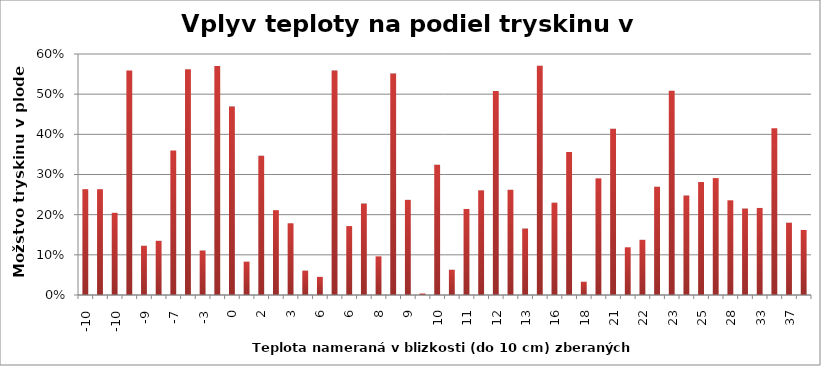
| Category | Series 0 |
|---|---|
| -9.6 | 0.263 |
| -9.6 | 0.263 |
| -9.52 | 0.205 |
| -8.81 | 0.559 |
| -8.74 | 0.123 |
| -8.46 | 0.135 |
| -6.75 | 0.36 |
| -5.08 | 0.562 |
| -2.69 | 0.111 |
| -0.13 | 0.57 |
| 0.39 | 0.469 |
| 0.75 | 0.083 |
| 1.88 | 0.347 |
| 2.48 | 0.211 |
| 2.95 | 0.179 |
| 3.17 | 0.061 |
| 5.56 | 0.045 |
| 5.61 | 0.559 |
| 6.28 | 0.172 |
| 8.43 | 0.228 |
| 8.47 | 0.096 |
| 9.0 | 0.551 |
| 9.09 | 0.237 |
| 9.18 | 0.004 |
| 10.34 | 0.325 |
| 10.65 | 0.063 |
| 11.03 | 0.214 |
| 12.03 | 0.261 |
| 12.45 | 0.508 |
| 12.626799999999994 | 0.262 |
| 13.21 | 0.165 |
| 13.25 | 0.571 |
| 16.18 | 0.23 |
| 17.16 | 0.356 |
| 17.58 | 0.033 |
| 18.52 | 0.29 |
| 20.76 | 0.414 |
| 21.14 | 0.119 |
| 21.65 | 0.137 |
| 22.46 | 0.27 |
| 23.16 | 0.509 |
| 23.91 | 0.248 |
| 25.38 | 0.281 |
| 27.46 | 0.291 |
| 27.75 | 0.236 |
| 31.87 | 0.215 |
| 32.84 | 0.217 |
| 34.13 | 0.415 |
| 36.83 | 0.18 |
| 37.72 | 0.162 |